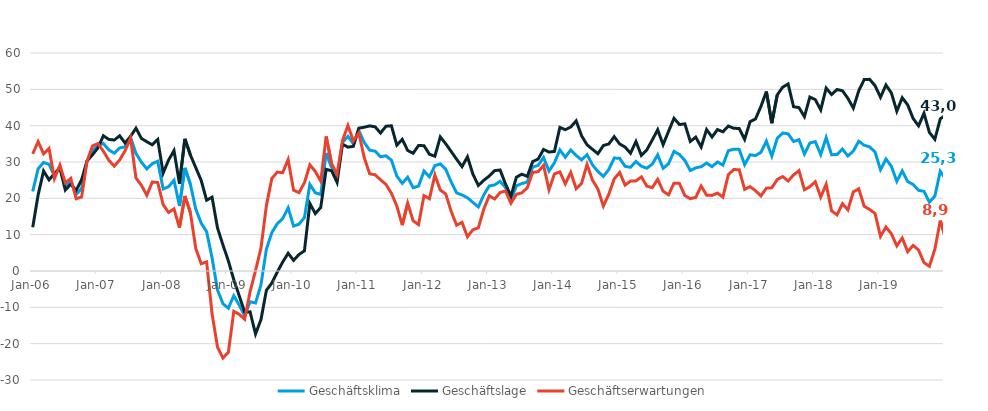
| Category | Geschäftsklima | Geschäftslage | Geschäftserwartungen |
|---|---|---|---|
| 2006-01-01 | 21.907 | 12.047 | 32.226 |
| 2006-02-01 | 28.17 | 20.964 | 35.612 |
| 2006-03-01 | 29.874 | 27.528 | 32.244 |
| 2006-04-01 | 29.369 | 25.085 | 33.733 |
| 2006-05-01 | 26.128 | 26.825 | 25.433 |
| 2006-06-01 | 28.74 | 28.314 | 29.167 |
| 2006-07-01 | 23.271 | 22.29 | 24.256 |
| 2006-08-01 | 24.689 | 23.883 | 25.497 |
| 2006-09-01 | 21.051 | 22.207 | 19.9 |
| 2006-10-01 | 22.746 | 25.135 | 20.383 |
| 2006-11-01 | 30.28 | 30.306 | 30.255 |
| 2006-12-01 | 33.202 | 31.984 | 34.425 |
| 2007-01-01 | 34.474 | 33.872 | 35.077 |
| 2007-02-01 | 35.091 | 37.222 | 32.978 |
| 2007-03-01 | 33.335 | 36.217 | 30.488 |
| 2007-04-01 | 32.424 | 36.046 | 28.857 |
| 2007-05-01 | 33.863 | 37.211 | 30.563 |
| 2007-06-01 | 34.16 | 35.22 | 33.105 |
| 2007-07-01 | 36.827 | 37.043 | 36.611 |
| 2007-08-01 | 32.352 | 39.307 | 25.599 |
| 2007-09-01 | 29.952 | 36.489 | 23.597 |
| 2007-10-01 | 28.09 | 35.57 | 20.847 |
| 2007-11-01 | 29.549 | 34.724 | 24.488 |
| 2007-12-01 | 30.209 | 36.215 | 24.356 |
| 2008-01-01 | 22.579 | 26.953 | 18.29 |
| 2008-02-01 | 23.205 | 30.533 | 16.109 |
| 2008-03-01 | 24.974 | 33.139 | 17.096 |
| 2008-04-01 | 17.899 | 24.06 | 11.908 |
| 2008-05-01 | 28.386 | 36.382 | 20.661 |
| 2008-06-01 | 23.938 | 31.987 | 16.169 |
| 2008-07-01 | 17.057 | 28.452 | 6.23 |
| 2008-08-01 | 13.17 | 24.947 | 2.01 |
| 2008-09-01 | 10.821 | 19.482 | 2.502 |
| 2008-10-01 | 3.65 | 20.315 | -11.754 |
| 2008-11-01 | -5.213 | 11.866 | -20.916 |
| 2008-12-01 | -9.012 | 7.185 | -23.943 |
| 2009-01-01 | -10.234 | 2.786 | -22.417 |
| 2009-02-01 | -6.792 | -2.407 | -11.081 |
| 2009-03-01 | -9.382 | -6.817 | -11.912 |
| 2009-04-01 | -12.326 | -11.358 | -13.29 |
| 2009-05-01 | -8.476 | -11.244 | -5.667 |
| 2009-06-01 | -8.804 | -17.335 | 0.125 |
| 2009-07-01 | -3.788 | -13.386 | 6.305 |
| 2009-08-01 | 6.009 | -5.314 | 17.99 |
| 2009-09-01 | 10.584 | -3.32 | 25.471 |
| 2009-10-01 | 13.016 | -0.297 | 27.217 |
| 2009-11-01 | 14.42 | 2.472 | 27.074 |
| 2009-12-01 | 17.399 | 4.881 | 30.682 |
| 2010-01-01 | 12.365 | 2.931 | 22.238 |
| 2010-02-01 | 12.887 | 4.55 | 21.564 |
| 2010-03-01 | 14.73 | 5.561 | 24.307 |
| 2010-04-01 | 23.839 | 18.577 | 29.229 |
| 2010-05-01 | 21.527 | 15.801 | 27.405 |
| 2010-06-01 | 21.074 | 17.498 | 24.71 |
| 2010-07-01 | 32.466 | 27.986 | 37.035 |
| 2010-08-01 | 28.588 | 27.591 | 29.59 |
| 2010-09-01 | 25.483 | 24.399 | 26.573 |
| 2010-10-01 | 35.399 | 34.909 | 35.89 |
| 2010-11-01 | 37.047 | 34.09 | 40.041 |
| 2010-12-01 | 35.039 | 34.296 | 35.784 |
| 2011-01-01 | 38.652 | 39.301 | 38.004 |
| 2011-02-01 | 35.38 | 39.57 | 31.264 |
| 2011-03-01 | 33.255 | 39.938 | 26.758 |
| 2011-04-01 | 32.986 | 39.68 | 26.478 |
| 2011-05-01 | 31.453 | 37.972 | 25.112 |
| 2011-06-01 | 31.696 | 39.842 | 23.827 |
| 2011-07-01 | 30.507 | 39.979 | 21.41 |
| 2011-08-01 | 26.105 | 34.634 | 17.886 |
| 2011-09-01 | 24.118 | 36.236 | 12.621 |
| 2011-10-01 | 25.816 | 33.172 | 18.692 |
| 2011-11-01 | 22.924 | 32.405 | 13.83 |
| 2011-12-01 | 23.385 | 34.546 | 12.756 |
| 2012-01-01 | 27.507 | 34.487 | 20.735 |
| 2012-02-01 | 25.927 | 32.13 | 19.891 |
| 2012-03-01 | 28.989 | 31.592 | 26.416 |
| 2012-04-01 | 29.472 | 36.905 | 22.273 |
| 2012-05-01 | 27.996 | 35.009 | 21.193 |
| 2012-06-01 | 24.506 | 32.886 | 16.428 |
| 2012-07-01 | 21.5 | 30.76 | 12.611 |
| 2012-08-01 | 20.919 | 28.72 | 13.384 |
| 2012-09-01 | 20.155 | 31.433 | 9.425 |
| 2012-10-01 | 18.872 | 26.651 | 11.361 |
| 2012-11-01 | 17.627 | 23.537 | 11.873 |
| 2012-12-01 | 20.951 | 24.968 | 17.006 |
| 2013-01-01 | 23.413 | 26.133 | 20.726 |
| 2013-02-01 | 23.687 | 27.621 | 19.822 |
| 2013-03-01 | 24.678 | 27.808 | 21.59 |
| 2013-04-01 | 22.986 | 23.94 | 22.036 |
| 2013-05-01 | 19.624 | 20.608 | 18.643 |
| 2013-06-01 | 23.444 | 25.816 | 21.097 |
| 2013-07-01 | 24.064 | 26.639 | 21.518 |
| 2013-08-01 | 24.473 | 26.055 | 22.902 |
| 2013-09-01 | 28.621 | 30.106 | 27.146 |
| 2013-10-01 | 29.074 | 30.819 | 27.342 |
| 2013-11-01 | 31.258 | 33.456 | 29.08 |
| 2013-12-01 | 27.495 | 32.739 | 22.37 |
| 2014-01-01 | 29.793 | 32.91 | 26.717 |
| 2014-02-01 | 33.324 | 39.528 | 27.281 |
| 2014-03-01 | 31.31 | 38.884 | 23.977 |
| 2014-04-01 | 33.316 | 39.633 | 27.166 |
| 2014-05-01 | 31.795 | 41.314 | 22.65 |
| 2014-06-01 | 30.572 | 37.197 | 24.133 |
| 2014-07-01 | 32.02 | 34.741 | 29.331 |
| 2014-08-01 | 29.208 | 33.49 | 25.005 |
| 2014-09-01 | 27.382 | 32.287 | 22.581 |
| 2014-10-01 | 26.04 | 34.534 | 17.854 |
| 2014-11-01 | 27.929 | 34.963 | 21.107 |
| 2014-12-01 | 31.092 | 36.975 | 25.355 |
| 2015-01-01 | 31.014 | 34.97 | 27.125 |
| 2015-02-01 | 28.814 | 34.101 | 23.646 |
| 2015-03-01 | 28.542 | 32.411 | 24.738 |
| 2015-04-01 | 30.153 | 35.638 | 24.796 |
| 2015-05-01 | 28.838 | 31.804 | 25.91 |
| 2015-06-01 | 28.295 | 33.34 | 23.359 |
| 2015-07-01 | 29.408 | 36.057 | 22.947 |
| 2015-08-01 | 31.964 | 38.883 | 25.244 |
| 2015-09-01 | 28.271 | 34.756 | 21.966 |
| 2015-10-01 | 29.547 | 38.456 | 20.971 |
| 2015-11-01 | 32.929 | 42.027 | 24.173 |
| 2015-12-01 | 32.069 | 40.303 | 24.116 |
| 2016-01-01 | 30.421 | 40.504 | 20.761 |
| 2016-02-01 | 27.647 | 35.658 | 19.908 |
| 2016-03-01 | 28.404 | 36.841 | 20.268 |
| 2016-04-01 | 28.691 | 34.126 | 23.381 |
| 2016-05-01 | 29.724 | 38.933 | 20.869 |
| 2016-06-01 | 28.701 | 36.878 | 20.806 |
| 2016-07-01 | 30.02 | 38.924 | 21.448 |
| 2016-08-01 | 29.143 | 38.311 | 20.327 |
| 2016-09-01 | 33.11 | 39.895 | 26.517 |
| 2016-10-01 | 33.538 | 39.274 | 27.94 |
| 2016-11-01 | 33.471 | 39.228 | 27.853 |
| 2016-12-01 | 29.254 | 36.243 | 22.471 |
| 2017-01-01 | 31.982 | 41.107 | 23.202 |
| 2017-02-01 | 31.774 | 41.867 | 22.103 |
| 2017-03-01 | 32.654 | 45.3 | 20.659 |
| 2017-04-01 | 35.718 | 49.388 | 22.797 |
| 2017-05-01 | 31.623 | 40.692 | 22.896 |
| 2017-06-01 | 36.535 | 48.461 | 25.182 |
| 2017-07-01 | 37.976 | 50.594 | 25.994 |
| 2017-08-01 | 37.754 | 51.477 | 24.781 |
| 2017-09-01 | 35.643 | 45.224 | 26.436 |
| 2017-10-01 | 36.135 | 44.958 | 27.629 |
| 2017-11-01 | 32.209 | 42.486 | 22.367 |
| 2017-12-01 | 35.215 | 47.87 | 23.206 |
| 2018-01-01 | 35.605 | 47.177 | 24.575 |
| 2018-02-01 | 32.041 | 44.353 | 20.35 |
| 2018-03-01 | 36.729 | 50.334 | 23.863 |
| 2018-04-01 | 32.012 | 48.57 | 16.557 |
| 2018-05-01 | 32.062 | 49.957 | 15.448 |
| 2018-06-01 | 33.557 | 49.603 | 18.542 |
| 2018-07-01 | 31.661 | 47.52 | 16.818 |
| 2018-08-01 | 33.01 | 44.824 | 21.766 |
| 2018-09-01 | 35.733 | 49.618 | 22.621 |
| 2018-10-01 | 34.61 | 52.686 | 17.828 |
| 2018-11-01 | 34.156 | 52.752 | 16.928 |
| 2018-12-01 | 32.756 | 51.003 | 15.835 |
| 2019-01-01 | 27.866 | 47.818 | 9.52 |
| 2019-02-01 | 30.823 | 51.2 | 12.099 |
| 2019-03-01 | 28.817 | 49.012 | 10.26 |
| 2019-04-01 | 24.69 | 43.99 | 6.916 |
| 2019-05-01 | 27.566 | 47.692 | 9.075 |
| 2019-06-01 | 24.615 | 45.73 | 5.315 |
| 2019-07-01 | 23.828 | 41.975 | 7.043 |
| 2019-08-01 | 22.216 | 39.956 | 5.788 |
| 2019-09-01 | 21.919 | 43.411 | 2.324 |
| 2019-10-01 | 18.944 | 38.131 | 1.304 |
| 2019-11-01 | 20.596 | 36.254 | 5.975 |
| 2019-12-01 | 27.443 | 41.877 | 13.871 |
| 2020-01-01 | 25.289 | 42.955 | 8.908 |